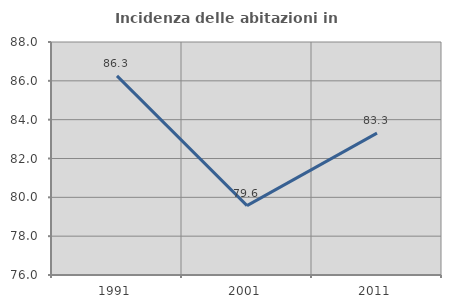
| Category | Incidenza delle abitazioni in proprietà  |
|---|---|
| 1991.0 | 86.255 |
| 2001.0 | 79.57 |
| 2011.0 | 83.306 |